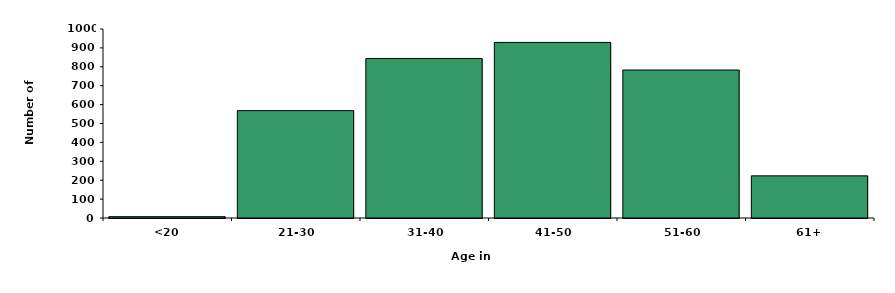
| Category | Series 0 |
|---|---|
| <20 | 7 |
| 21-30 | 568 |
| 31-40 | 844 |
| 41-50 | 929 |
| 51-60 | 783 |
| 61+ | 223 |